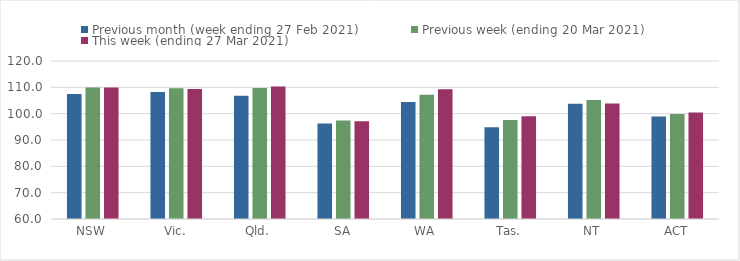
| Category | Previous month (week ending 27 Feb 2021) | Previous week (ending 20 Mar 2021) | This week (ending 27 Mar 2021) |
|---|---|---|---|
| NSW | 107.43 | 109.94 | 109.94 |
| Vic. | 108.25 | 109.68 | 109.35 |
| Qld. | 106.77 | 109.75 | 110.27 |
| SA | 96.23 | 97.4 | 97.14 |
| WA | 104.43 | 107.21 | 109.26 |
| Tas. | 94.81 | 97.62 | 99 |
| NT | 103.81 | 105.23 | 103.88 |
| ACT | 98.88 | 99.91 | 100.43 |